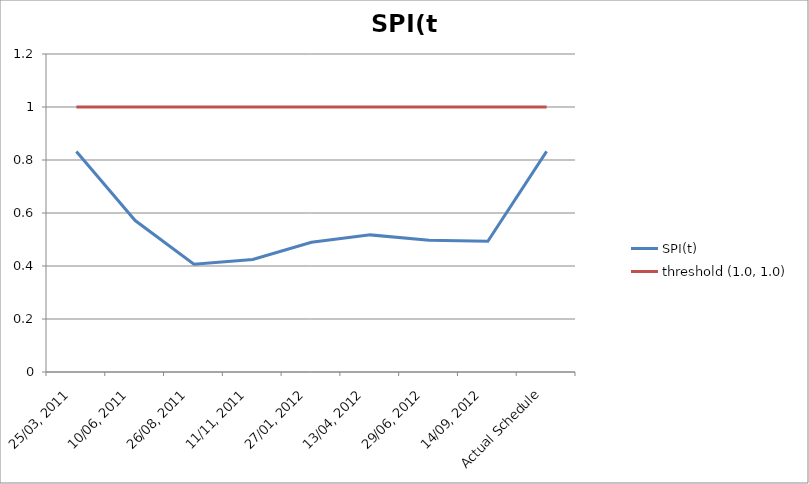
| Category | SPI(t) | threshold (1.0, 1.0) |
|---|---|---|
| 25/03, 2011 | 0.832 | 1 |
| 10/06, 2011 | 0.572 | 1 |
| 26/08, 2011 | 0.407 | 1 |
| 11/11, 2011 | 0.424 | 1 |
| 27/01, 2012 | 0.49 | 1 |
| 13/04, 2012 | 0.517 | 1 |
| 29/06, 2012 | 0.497 | 1 |
| 14/09, 2012 | 0.493 | 1 |
| Actual Schedule | 0.832 | 1 |